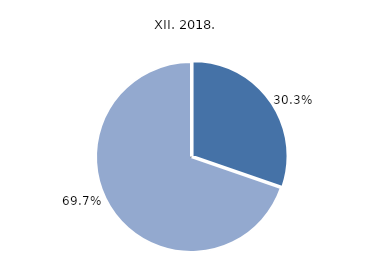
| Category | 2018. |
|---|---|
| domaći | 30.3 |
| inozemni | 69.7 |